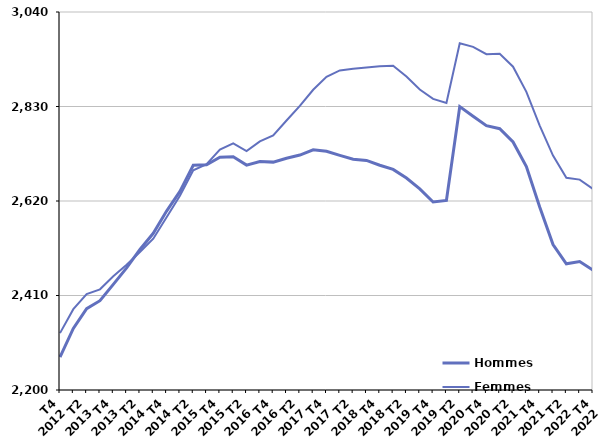
| Category | Hommes  | Femmes  |
|---|---|---|
| T4
2012 | 2273.2 | 2326.4 |
| T1
2013 | 2336.8 | 2379.6 |
| T2
2013 | 2380.7 | 2413.3 |
| T3
2013 | 2398.4 | 2423.7 |
| T4
2013 | 2434.8 | 2452.7 |
| T1
2014 | 2471.2 | 2478.2 |
| T2
2014 | 2512.3 | 2506.5 |
| T3
2014 | 2548.3 | 2536.3 |
| T4
2014 | 2597.7 | 2584 |
| T1
2015 | 2641.3 | 2631.8 |
| T2
2015 | 2699.5 | 2688.2 |
| T3
2015 | 2700.4 | 2702.1 |
| T4
2015 | 2717.4 | 2734.1 |
| T1
2016 | 2718.3 | 2748.2 |
| T2
2016 | 2699.8 | 2731 |
| T3
2016 | 2707.6 | 2752.5 |
| T4
2016 | 2706.4 | 2765.8 |
| T1
2017 | 2715 | 2798.8 |
| T2
2017 | 2722.1 | 2831.2 |
| T3
2017 | 2733.6 | 2867.2 |
| T4
2017 | 2730.4 | 2896 |
| T1
2018 | 2721.4 | 2910.1 |
| T2
2018 | 2713 | 2913.8 |
| T3
2018 | 2710.2 | 2916.6 |
| T4
2018 | 2699.5 | 2919.5 |
| T1
2019 | 2690.2 | 2920.5 |
| T2
2019 | 2671 | 2896.6 |
| T3
2019 | 2647 | 2867.6 |
| T4
2019 | 2617.8 | 2846.9 |
| T1
2020 | 2621.2 | 2837.8 |
| T2
2020 | 2829.8 | 2970.7 |
| T3
2020 | 2808.2 | 2962.5 |
| T4
2020 | 2787.3 | 2946.3 |
| T1
2021 | 2780.6 | 2947.2 |
| T2
2021 | 2751.2 | 2918.5 |
| T3
2021 | 2696.6 | 2862.6 |
| T4
2021 | 2606.6 | 2787.7 |
| T1
2022 | 2523.3 | 2720.9 |
| T2
2022 | 2480.5 | 2671.7 |
| T3
2022 | 2485.5 | 2667.5 |
| T4
2022 | 2466.5 | 2646.8 |